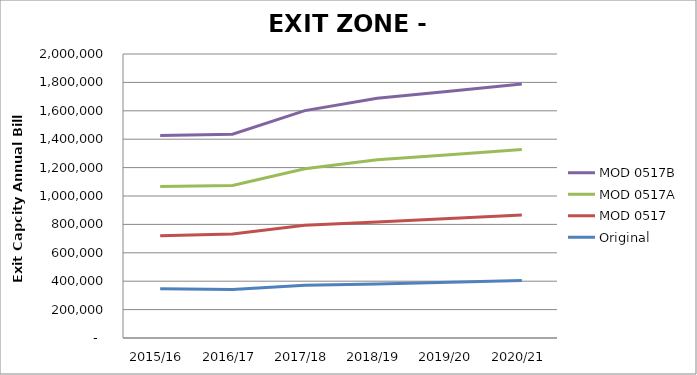
| Category | Original | MOD 0517 | MOD 0517A | MOD 0517B |
|---|---|---|---|---|
| 2015/16 | 346839.816 | 373983.802 | 346839.816 | 358903.81 |
| 2016/17 | 340807.819 | 392079.792 | 340807.819 | 361919.808 |
| 2017/18 | 370967.803 | 422239.776 | 398111.789 | 410175.782 |
| 2018/19 | 380015.798 | 437319.768 | 437319.768 | 434303.77 |
| 2019/20 | 392079.792 | 449383.762 | 449383.762 | 446367.763 |
| 2020/21 | 404143.786 | 461447.755 | 461447.755 | 461447.755 |